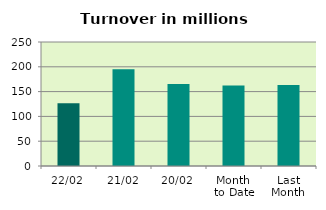
| Category | Series 0 |
|---|---|
| 22/02 | 126.583 |
| 21/02 | 195.23 |
| 20/02 | 165.387 |
| Month 
to Date | 162.544 |
| Last
Month | 163.101 |